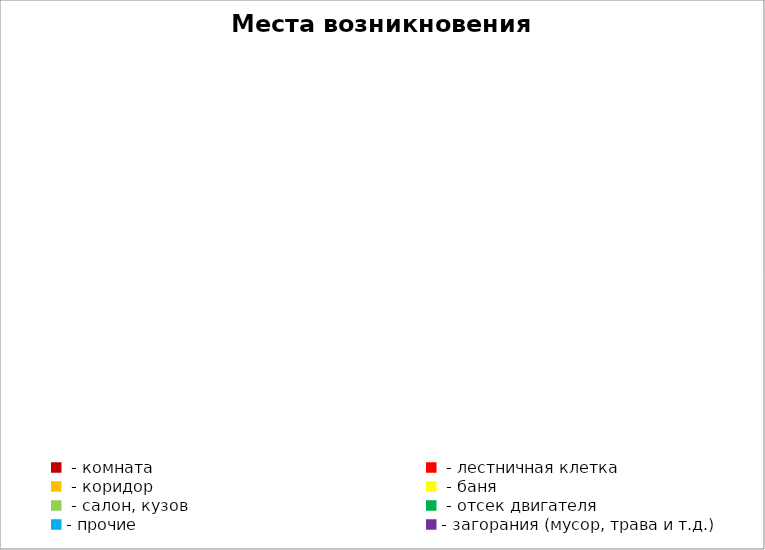
| Category | Места возникновения пожара |
|---|---|
|  - комната | 1 |
|  - лестничная клетка | 1 |
|  - коридор | 0 |
|  - баня | 4 |
|  - салон, кузов | 1 |
|  - отсек двигателя | 3 |
| - прочие | 4 |
| - загорания (мусор, трава и т.д.)  | 7 |